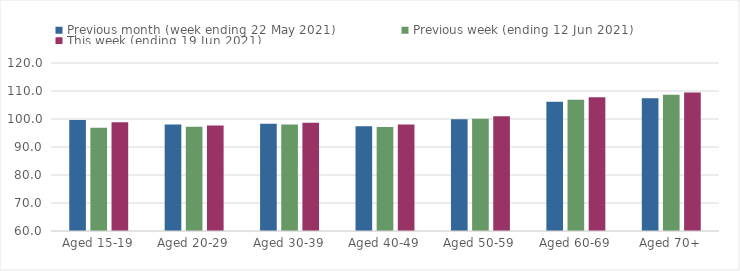
| Category | Previous month (week ending 22 May 2021) | Previous week (ending 12 Jun 2021) | This week (ending 19 Jun 2021) |
|---|---|---|---|
| Aged 15-19 | 99.61 | 96.85 | 98.81 |
| Aged 20-29 | 98 | 97.2 | 97.7 |
| Aged 30-39 | 98.3 | 98.01 | 98.66 |
| Aged 40-49 | 97.38 | 97.14 | 98.03 |
| Aged 50-59 | 99.94 | 100.11 | 101 |
| Aged 60-69 | 106.13 | 106.88 | 107.8 |
| Aged 70+ | 107.44 | 108.65 | 109.43 |